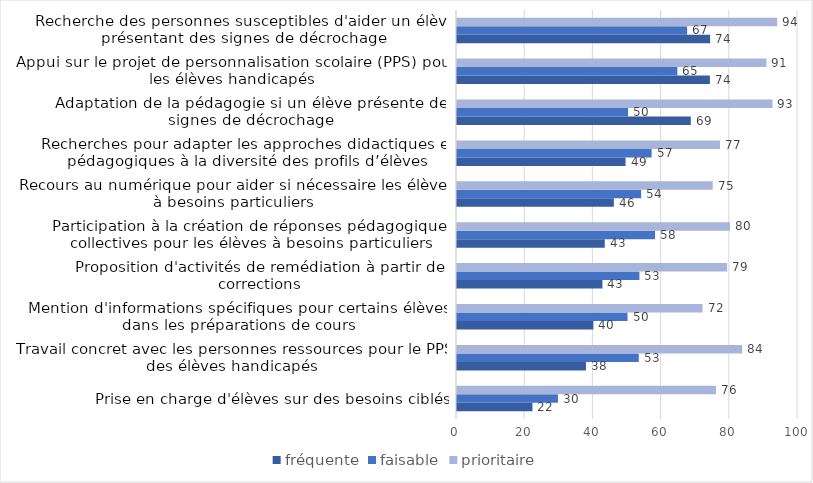
| Category | fréquente | faisable | prioritaire |
|---|---|---|---|
| Prise en charge d'élèves sur des besoins ciblés | 22.118 | 29.606 | 75.963 |
| Travail concret avec les personnes ressources pour le PPS des élèves handicapés | 37.819 | 53.311 | 83.637 |
| Mention d'informations spécifiques pour certains élèves  dans les préparations de cours | 40 | 50 | 72 |
| Proposition d'activités de remédiation à partir des corrections | 42.642 | 53.491 | 79.23 |
| Participation à la création de réponses pédagogiques collectives pour les élèves à besoins particuliers | 43.333 | 58.082 | 80.058 |
| Recours au numérique pour aider si nécessaire les élèves à besoins particuliers | 46 | 54 | 75 |
| Recherches pour adapter les approches didactiques et pédagogiques à la diversité des profils d’élèves | 49.433 | 57.066 | 77.113 |
| Adaptation de la pédagogie si un élève présente des signes de décrochage | 68.555 | 50.169 | 92.511 |
| Appui sur le projet de personnalisation scolaire (PPS) pour les élèves handicapés | 74.164 | 64.613 | 90.749 |
| Recherche des personnes susceptibles d'aider un élève présentant des signes de décrochage | 74.232 | 67.493 | 93.907 |